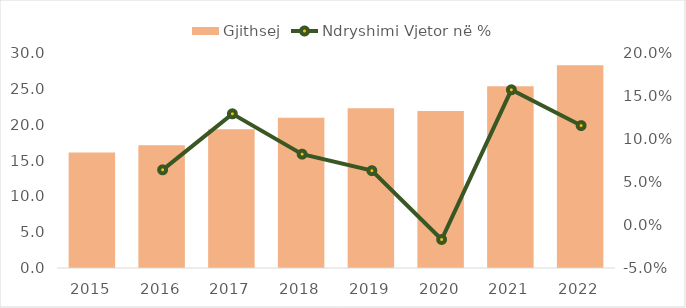
| Category | Gjithsej |
|---|---|
| 2015.0 | 16.111 |
| 2016.0 | 17.144 |
| 2017.0 | 19.361 |
| 2018.0 | 20.956 |
| 2019.0 | 22.28 |
| 2020.0 | 21.904 |
| 2021.0 | 25.347 |
| 2022.0 | 28.278 |